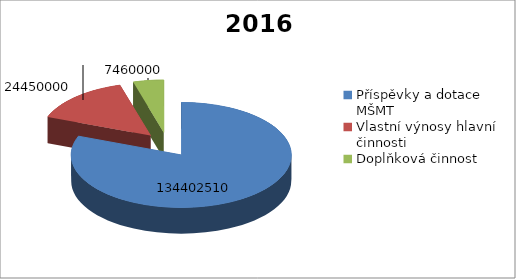
| Category | 2016 |
|---|---|
| Příspěvky a dotace MŠMT | 134402510 |
| Vlastní výnosy hlavní činnosti | 24450000 |
| Doplňková činnost | 7460000 |